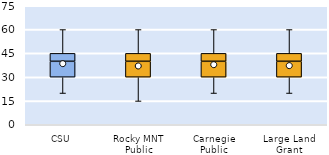
| Category | 25th | 50th | 75th |
|---|---|---|---|
| CSU | 30 | 10 | 5 |
| Rocky MNT Public | 30 | 10 | 5 |
| Carnegie Public | 30 | 10 | 5 |
| Large Land Grant | 30 | 10 | 5 |